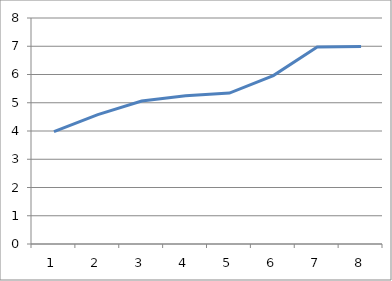
| Category | Series 0 |
|---|---|
| 0 | 3.981 |
| 1 | 4.581 |
| 2 | 5.062 |
| 3 | 5.249 |
| 4 | 5.342 |
| 5 | 5.963 |
| 6 | 6.973 |
| 7 | 6.99 |